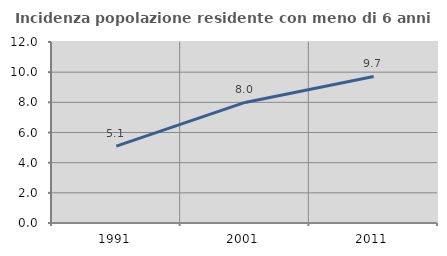
| Category | Incidenza popolazione residente con meno di 6 anni |
|---|---|
| 1991.0 | 5.096 |
| 2001.0 | 7.993 |
| 2011.0 | 9.715 |